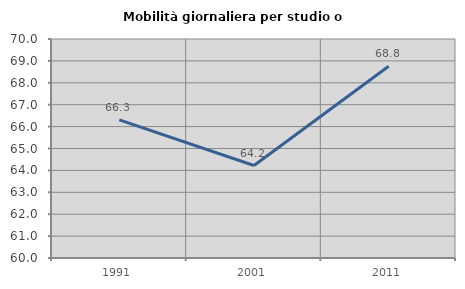
| Category | Mobilità giornaliera per studio o lavoro |
|---|---|
| 1991.0 | 66.308 |
| 2001.0 | 64.223 |
| 2011.0 | 68.757 |